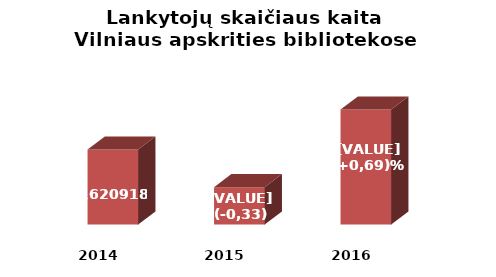
| Category | Series 0 |
|---|---|
| 2014.0 | 1620918 |
| 2015.0 | 1615448 |
| 2016.0 | 1626756 |